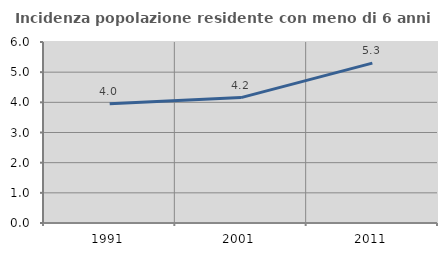
| Category | Incidenza popolazione residente con meno di 6 anni |
|---|---|
| 1991.0 | 3.957 |
| 2001.0 | 4.158 |
| 2011.0 | 5.298 |